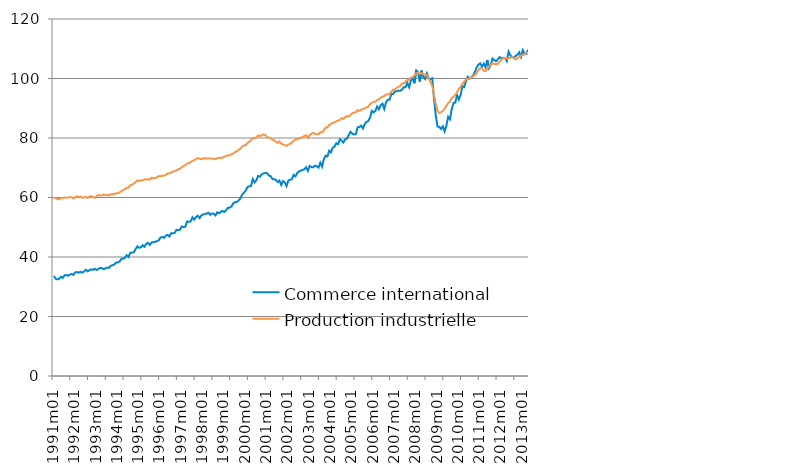
| Category | Commerce international | Production industrielle mondiale |
|---|---|---|
| 1991m01 | 33.647 | 59.906 |
| 1991m02 | 32.69 | 59.804 |
| 1991m03 | 32.465 | 59.437 |
| 1991m04 | 32.705 | 59.439 |
| 1991m05 | 33.379 | 59.778 |
| 1991m06 | 32.988 | 59.834 |
| 1991m07 | 33.84 | 60.025 |
| 1991m08 | 33.919 | 59.941 |
| 1991m09 | 33.708 | 59.915 |
| 1991m10 | 34.072 | 60.129 |
| 1991m11 | 34.305 | 60.106 |
| 1991m12 | 34.005 | 59.653 |
| 1992m01 | 34.847 | 60.139 |
| 1992m02 | 34.938 | 60.374 |
| 1992m03 | 34.723 | 60.259 |
| 1992m04 | 35.042 | 60.294 |
| 1992m05 | 34.722 | 59.939 |
| 1992m06 | 35.137 | 60.062 |
| 1992m07 | 35.706 | 60.171 |
| 1992m08 | 35.18 | 59.822 |
| 1992m09 | 35.55 | 60.334 |
| 1992m10 | 35.858 | 60.445 |
| 1992m11 | 35.686 | 60.215 |
| 1992m12 | 36.028 | 59.877 |
| 1993m01 | 35.6 | 60.415 |
| 1993m02 | 35.998 | 60.854 |
| 1993m03 | 36.281 | 60.633 |
| 1993m04 | 36.274 | 60.755 |
| 1993m05 | 35.865 | 60.948 |
| 1993m06 | 36.149 | 60.833 |
| 1993m07 | 36.415 | 60.808 |
| 1993m08 | 36.407 | 60.679 |
| 1993m09 | 37.025 | 61.085 |
| 1993m10 | 37.214 | 61.046 |
| 1993m11 | 37.484 | 61.122 |
| 1993m12 | 38.133 | 61.402 |
| 1994m01 | 38.156 | 61.399 |
| 1994m02 | 38.479 | 61.708 |
| 1994m03 | 39.379 | 62.11 |
| 1994m04 | 39.436 | 62.559 |
| 1994m05 | 39.733 | 62.751 |
| 1994m06 | 40.608 | 63.291 |
| 1994m07 | 39.991 | 63.27 |
| 1994m08 | 41.418 | 64.091 |
| 1994m09 | 41.48 | 64.254 |
| 1994m10 | 41.592 | 64.679 |
| 1994m11 | 42.621 | 65.19 |
| 1994m12 | 43.592 | 65.742 |
| 1995m01 | 43.09 | 65.545 |
| 1995m02 | 43.266 | 65.688 |
| 1995m03 | 43.954 | 65.792 |
| 1995m04 | 43.419 | 66.108 |
| 1995m05 | 44.475 | 66.024 |
| 1995m06 | 44.735 | 66.154 |
| 1995m07 | 44.05 | 66.033 |
| 1995m08 | 44.896 | 66.641 |
| 1995m09 | 45.032 | 66.448 |
| 1995m10 | 45.059 | 66.472 |
| 1995m11 | 45.353 | 66.804 |
| 1995m12 | 45.59 | 67.193 |
| 1996m01 | 46.5 | 67.127 |
| 1996m02 | 46.776 | 67.36 |
| 1996m03 | 46.446 | 67.312 |
| 1996m04 | 47.15 | 67.58 |
| 1996m05 | 47.43 | 68.059 |
| 1996m06 | 46.897 | 68.122 |
| 1996m07 | 47.959 | 68.393 |
| 1996m08 | 47.968 | 68.66 |
| 1996m09 | 48.094 | 68.922 |
| 1996m10 | 49.121 | 69.077 |
| 1996m11 | 49.062 | 69.464 |
| 1996m12 | 49.162 | 69.661 |
| 1997m01 | 50.275 | 70.198 |
| 1997m02 | 50.069 | 70.575 |
| 1997m03 | 50.157 | 70.841 |
| 1997m04 | 51.956 | 71.465 |
| 1997m05 | 51.813 | 71.537 |
| 1997m06 | 51.986 | 71.912 |
| 1997m07 | 53.341 | 72.299 |
| 1997m08 | 52.539 | 72.567 |
| 1997m09 | 53.415 | 72.822 |
| 1997m10 | 53.898 | 73.279 |
| 1997m11 | 53.074 | 73.049 |
| 1997m12 | 53.949 | 72.871 |
| 1998m01 | 54.267 | 73.161 |
| 1998m02 | 54.436 | 73.162 |
| 1998m03 | 54.603 | 73.07 |
| 1998m04 | 54.911 | 73.159 |
| 1998m05 | 54.151 | 73.144 |
| 1998m06 | 54.631 | 73.067 |
| 1998m07 | 54.555 | 73.052 |
| 1998m08 | 53.974 | 72.832 |
| 1998m09 | 55.043 | 73.224 |
| 1998m10 | 54.659 | 73.363 |
| 1998m11 | 55.265 | 73.305 |
| 1998m12 | 55.462 | 73.359 |
| 1999m01 | 55.136 | 73.814 |
| 1999m02 | 55.772 | 73.883 |
| 1999m03 | 56.542 | 74.191 |
| 1999m04 | 56.591 | 74.126 |
| 1999m05 | 57.002 | 74.578 |
| 1999m06 | 58.049 | 74.756 |
| 1999m07 | 58.436 | 75.273 |
| 1999m08 | 58.51 | 75.496 |
| 1999m09 | 59 | 76.046 |
| 1999m10 | 59.673 | 76.396 |
| 1999m11 | 60.978 | 77.145 |
| 1999m12 | 61.57 | 77.537 |
| 2000m01 | 62.316 | 77.556 |
| 2000m02 | 63.509 | 78.328 |
| 2000m03 | 63.756 | 78.717 |
| 2000m04 | 63.903 | 79.278 |
| 2000m05 | 66.195 | 79.927 |
| 2000m06 | 65.067 | 79.923 |
| 2000m07 | 65.783 | 80.238 |
| 2000m08 | 67.239 | 80.828 |
| 2000m09 | 66.997 | 80.647 |
| 2000m10 | 67.716 | 80.886 |
| 2000m11 | 68.118 | 81.179 |
| 2000m12 | 68.247 | 81.032 |
| 2001m01 | 68.204 | 80.221 |
| 2001m02 | 67.383 | 80.197 |
| 2001m03 | 67.222 | 79.95 |
| 2001m04 | 66.245 | 79.405 |
| 2001m05 | 66.135 | 79.265 |
| 2001m06 | 65.876 | 78.813 |
| 2001m07 | 65.195 | 78.354 |
| 2001m08 | 65.695 | 78.852 |
| 2001m09 | 64.202 | 78.1 |
| 2001m10 | 65.513 | 77.802 |
| 2001m11 | 65.097 | 77.621 |
| 2001m12 | 63.836 | 77.345 |
| 2002m01 | 65.672 | 77.799 |
| 2002m02 | 65.984 | 78.003 |
| 2002m03 | 66.125 | 78.537 |
| 2002m04 | 67.617 | 79.014 |
| 2002m05 | 67.108 | 79.581 |
| 2002m06 | 68.194 | 79.512 |
| 2002m07 | 68.776 | 79.865 |
| 2002m08 | 69.02 | 80.093 |
| 2002m09 | 69.278 | 80.334 |
| 2002m10 | 69.459 | 80.625 |
| 2002m11 | 70.156 | 80.929 |
| 2002m12 | 68.947 | 79.997 |
| 2003m01 | 70.616 | 80.924 |
| 2003m02 | 70.193 | 81.414 |
| 2003m03 | 70.202 | 81.774 |
| 2003m04 | 70.705 | 81.403 |
| 2003m05 | 70.492 | 81.236 |
| 2003m06 | 70.058 | 81.263 |
| 2003m07 | 71.705 | 81.932 |
| 2003m08 | 70.383 | 81.864 |
| 2003m09 | 72.871 | 82.583 |
| 2003m10 | 74.055 | 83.51 |
| 2003m11 | 73.786 | 83.557 |
| 2003m12 | 75.726 | 84.332 |
| 2004m01 | 75.181 | 84.72 |
| 2004m02 | 76.758 | 85.059 |
| 2004m03 | 77.053 | 85.186 |
| 2004m04 | 78.222 | 85.592 |
| 2004m05 | 77.914 | 85.88 |
| 2004m06 | 79.56 | 86.107 |
| 2004m07 | 79.13 | 86.691 |
| 2004m08 | 78.484 | 86.391 |
| 2004m09 | 79.54 | 86.994 |
| 2004m10 | 79.827 | 87.311 |
| 2004m11 | 80.966 | 87.244 |
| 2004m12 | 82.076 | 87.654 |
| 2005m01 | 81.516 | 88.316 |
| 2005m02 | 81.162 | 88.522 |
| 2005m03 | 81.289 | 88.687 |
| 2005m04 | 83.575 | 89.413 |
| 2005m05 | 83.692 | 89.11 |
| 2005m06 | 84.155 | 89.546 |
| 2005m07 | 83.191 | 89.69 |
| 2005m08 | 84.683 | 90.002 |
| 2005m09 | 85.431 | 90.249 |
| 2005m10 | 85.729 | 90.517 |
| 2005m11 | 86.845 | 91.403 |
| 2005m12 | 89.098 | 91.811 |
| 2006m01 | 88.598 | 92.135 |
| 2006m02 | 89.078 | 92.217 |
| 2006m03 | 90.599 | 92.754 |
| 2006m04 | 89.608 | 92.996 |
| 2006m05 | 91.035 | 93.568 |
| 2006m06 | 91.53 | 93.867 |
| 2006m07 | 89.744 | 94.084 |
| 2006m08 | 91.954 | 94.574 |
| 2006m09 | 92.83 | 94.729 |
| 2006m10 | 92.894 | 94.754 |
| 2006m11 | 94.808 | 95.538 |
| 2006m12 | 94.728 | 96.235 |
| 2007m01 | 95.63 | 96.273 |
| 2007m02 | 95.733 | 96.82 |
| 2007m03 | 95.939 | 97.231 |
| 2007m04 | 95.888 | 97.44 |
| 2007m05 | 96.225 | 98.365 |
| 2007m06 | 97.105 | 98.313 |
| 2007m07 | 97.042 | 98.878 |
| 2007m08 | 98.607 | 99.512 |
| 2007m09 | 97.061 | 99.526 |
| 2007m10 | 99.193 | 100.285 |
| 2007m11 | 100.183 | 100.518 |
| 2007m12 | 98.401 | 100.984 |
| 2008m01 | 102.707 | 101.684 |
| 2008m02 | 102.18 | 101.961 |
| 2008m03 | 98.948 | 101.529 |
| 2008m04 | 102.641 | 101.887 |
| 2008m05 | 100.536 | 101.295 |
| 2008m06 | 99.812 | 101.32 |
| 2008m07 | 101.675 | 101.022 |
| 2008m08 | 100 | 100 |
| 2008m09 | 99.794 | 98.934 |
| 2008m10 | 100.077 | 97.474 |
| 2008m11 | 93.344 | 94.392 |
| 2008m12 | 87.671 | 91.491 |
| 2009m01 | 83.859 | 89.082 |
| 2009m02 | 83.741 | 88.426 |
| 2009m03 | 83.017 | 88.65 |
| 2009m04 | 83.945 | 89.121 |
| 2009m05 | 82.248 | 89.847 |
| 2009m06 | 84.217 | 90.783 |
| 2009m07 | 87.107 | 91.724 |
| 2009m08 | 86.274 | 92.269 |
| 2009m09 | 89.689 | 93.375 |
| 2009m10 | 91.774 | 93.884 |
| 2009m11 | 91.881 | 94.544 |
| 2009m12 | 94.413 | 95.3 |
| 2010m01 | 92.929 | 96.503 |
| 2010m02 | 94.487 | 97.146 |
| 2010m03 | 97.428 | 98.153 |
| 2010m04 | 97.109 | 98.961 |
| 2010m05 | 99.005 | 99.723 |
| 2010m06 | 100.559 | 99.784 |
| 2010m07 | 100.006 | 100.107 |
| 2010m08 | 100.444 | 100.395 |
| 2010m09 | 100.959 | 100.663 |
| 2010m10 | 102.102 | 101.177 |
| 2010m11 | 103.728 | 101.893 |
| 2010m12 | 104.644 | 102.792 |
| 2011m01 | 105.093 | 103.52 |
| 2011m02 | 104.012 | 103.458 |
| 2011m03 | 104.969 | 102.671 |
| 2011m04 | 103.814 | 102.471 |
| 2011m05 | 106.201 | 103.314 |
| 2011m06 | 103.497 | 104.088 |
| 2011m07 | 104.691 | 104.596 |
| 2011m08 | 106.707 | 105.107 |
| 2011m09 | 106.168 | 104.904 |
| 2011m10 | 105.821 | 104.83 |
| 2011m11 | 106.455 | 104.962 |
| 2011m12 | 107.202 | 105.714 |
| 2012m01 | 106.726 | 106.303 |
| 2012m02 | 106.938 | 106.824 |
| 2012m03 | 106.881 | 106.873 |
| 2012m04 | 105.84 | 106.608 |
| 2012m05 | 109.009 | 106.852 |
| 2012m06 | 107.798 | 106.883 |
| 2012m07 | 107.191 | 107.212 |
| 2012m08 | 107.007 | 106.941 |
| 2012m09 | 107.588 | 106.407 |
| 2012m10 | 107.923 | 106.839 |
| 2012m11 | 108.815 | 107.198 |
| 2012m12 | 107.274 | 107.698 |
| 2013m01 | 109.547 | 107.838 |
| 2013m02 | 108.332 | 108.088 |
| 2013m03 | 108.213 | 108.565 |
| 2013m04 | 109.703 | 108.736 |